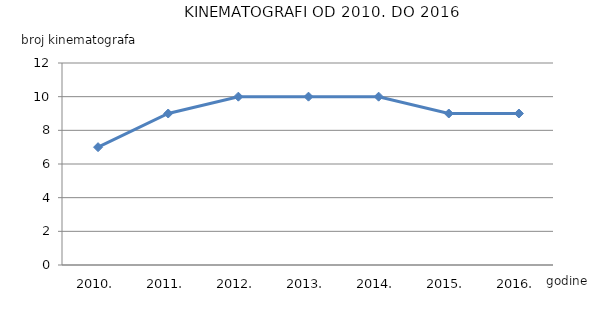
| Category | Broj kinematografa |
|---|---|
| 2010. | 7 |
| 2011. | 9 |
| 2012. | 10 |
| 2013. | 10 |
| 2014. | 10 |
| 2015. | 9 |
| 2016. | 9 |